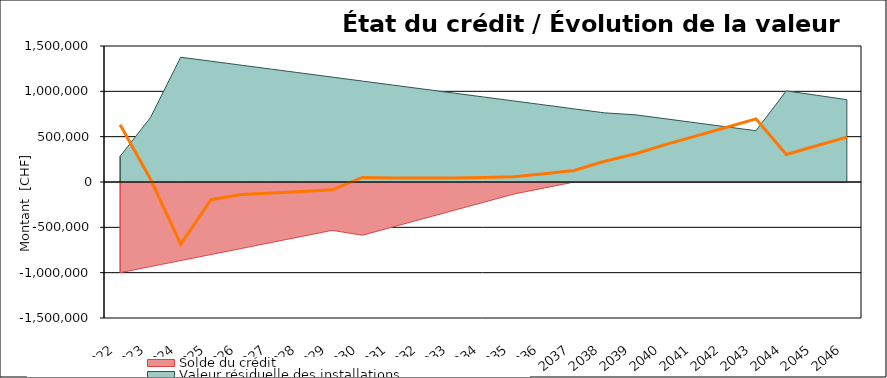
| Category | Cash-flow cumulé |
|---|---|
| 2022.0 | 630600 |
| 2023.0 | 32526 |
| 2024.0 | -684972.442 |
| 2025.0 | -194817.24 |
| 2026.0 | -137617.291 |
| 2027.0 | -122618.606 |
| 2028.0 | -105571.978 |
| 2029.0 | -86473.545 |
| 2030.0 | 49880.595 |
| 2031.0 | 45254.381 |
| 2032.0 | 43651.796 |
| 2033.0 | 45076.857 |
| 2034.0 | 49533.625 |
| 2035.0 | 57026.201 |
| 2036.0 | 90598.726 |
| 2037.0 | 126255.383 |
| 2038.0 | 229000.397 |
| 2039.0 | 308951.989 |
| 2040.0 | 412553.228 |
| 2041.0 | 506589.086 |
| 2042.0 | 601063.961 |
| 2043.0 | 695982.292 |
| 2044.0 | 303272.549 |
| 2045.0 | 399091.292 |
| 2046.0 | 495367.081 |